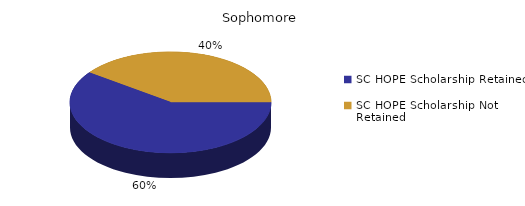
| Category | Sophomore |
|---|---|
| SC HOPE Scholarship Retained  | 3 |
| SC HOPE Scholarship Not Retained  | 2 |